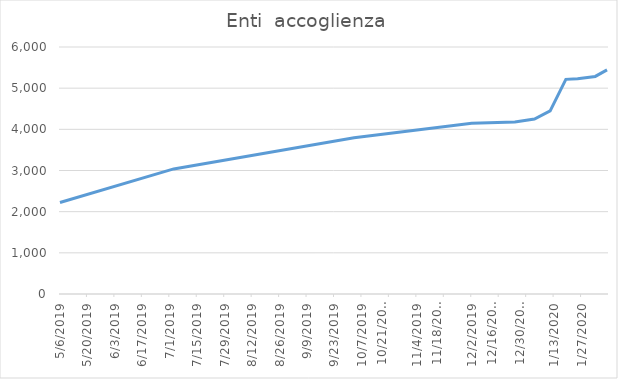
| Category | Enti  accoglienza |
|---|---|
| 5/6/19 | 2223 |
| 7/3/19 | 3038 |
| 10/3/19 | 3793 |
| 12/2/19 | 4149 |
| 12/24/19 | 4181 |
| 1/3/20 | 4249 |
| 1/11/20 | 4450 |
| 1/19/20 | 5214 |
| 1/25/20 | 5229 |
| 2/3/20 | 5285 |
| 2/9/20 | 5443 |